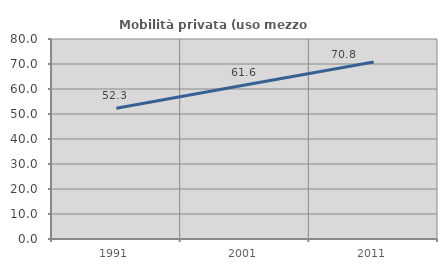
| Category | Mobilità privata (uso mezzo privato) |
|---|---|
| 1991.0 | 52.308 |
| 2001.0 | 61.567 |
| 2011.0 | 70.833 |